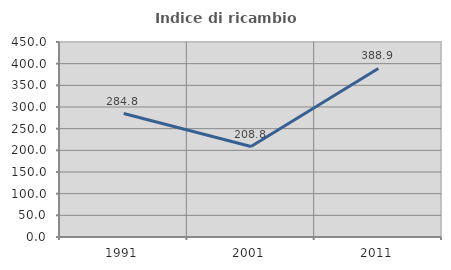
| Category | Indice di ricambio occupazionale  |
|---|---|
| 1991.0 | 284.848 |
| 2001.0 | 208.824 |
| 2011.0 | 388.889 |